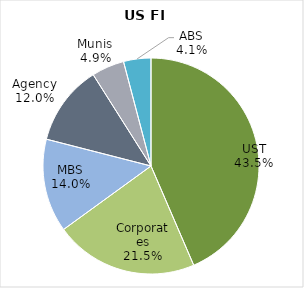
| Category | Fixed Income Issuance Breakout |
|---|---|
| UST | 0.435 |
| Corporates | 0.215 |
| MBS | 0.14 |
| Agency | 0.12 |
| Munis | 0.049 |
| ABS | 0.041 |